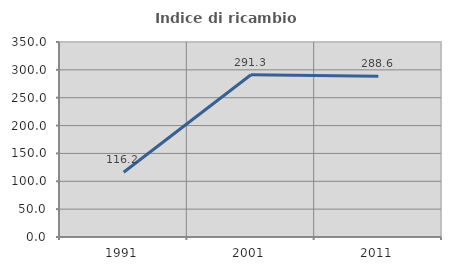
| Category | Indice di ricambio occupazionale  |
|---|---|
| 1991.0 | 116.216 |
| 2001.0 | 291.304 |
| 2011.0 | 288.636 |